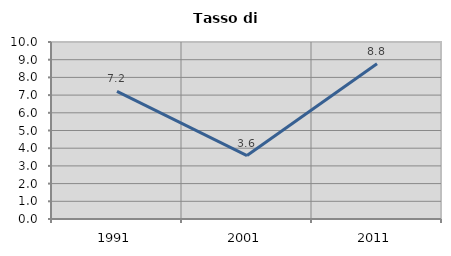
| Category | Tasso di disoccupazione   |
|---|---|
| 1991.0 | 7.205 |
| 2001.0 | 3.584 |
| 2011.0 | 8.773 |